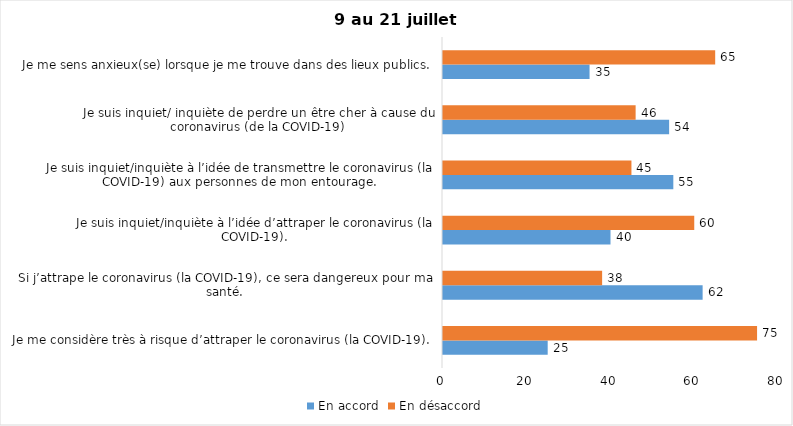
| Category | En accord | En désaccord |
|---|---|---|
| Je me considère très à risque d’attraper le coronavirus (la COVID-19). | 25 | 75 |
| Si j’attrape le coronavirus (la COVID-19), ce sera dangereux pour ma santé. | 62 | 38 |
| Je suis inquiet/inquiète à l’idée d’attraper le coronavirus (la COVID-19). | 40 | 60 |
| Je suis inquiet/inquiète à l’idée de transmettre le coronavirus (la COVID-19) aux personnes de mon entourage. | 55 | 45 |
| Je suis inquiet/ inquiète de perdre un être cher à cause du coronavirus (de la COVID-19) | 54 | 46 |
| Je me sens anxieux(se) lorsque je me trouve dans des lieux publics. | 35 | 65 |